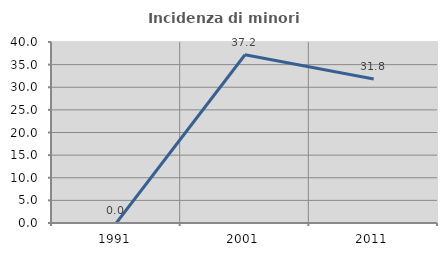
| Category | Incidenza di minori stranieri |
|---|---|
| 1991.0 | 0 |
| 2001.0 | 37.179 |
| 2011.0 | 31.841 |